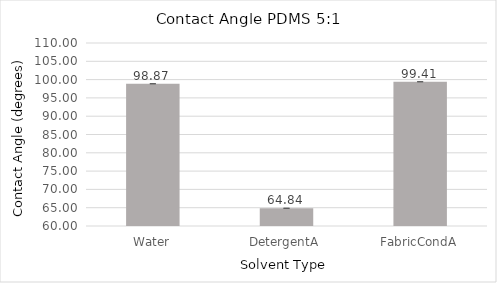
| Category | Series 0 |
|---|---|
| Water | 98.87 |
| DetergentA | 64.84 |
| FabricCondA | 99.413 |